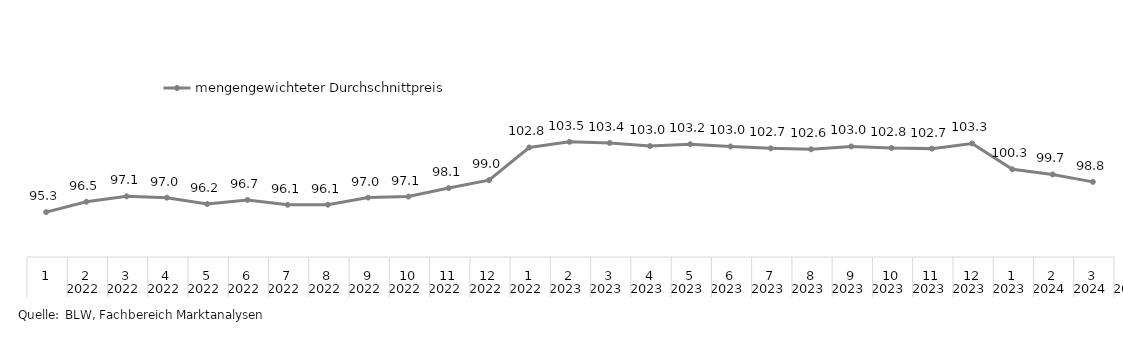
| Category | mengengewichteter Durchschnittpreis  |
|---|---|
| 0 | 98.804 |
| 1 | 99.675 |
| 2 | 100.274 |
| 3 | 103.308 |
| 4 | 102.7 |
| 5 | 102.77 |
| 6 | 102.962 |
| 7 | 102.621 |
| 8 | 102.733 |
| 9 | 102.951 |
| 10 | 103.216 |
| 11 | 103 |
| 12 | 103.363 |
| 13 | 103.494 |
| 14 | 102.832 |
| 15 | 99.003 |
| 16 | 98.076 |
| 17 | 97.082 |
| 18 | 96.959 |
| 19 | 96.128 |
| 20 | 96.12 |
| 21 | 96.686 |
| 22 | 96.206 |
| 23 | 96.953 |
| 24 | 97.105 |
| 25 | 96.474 |
| 26 | 95.257 |